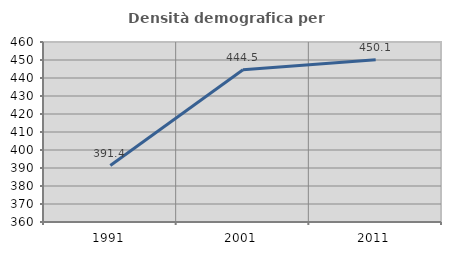
| Category | Densità demografica |
|---|---|
| 1991.0 | 391.385 |
| 2001.0 | 444.542 |
| 2011.0 | 450.084 |